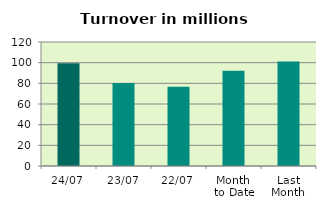
| Category | Series 0 |
|---|---|
| 24/07 | 99.48 |
| 23/07 | 80.367 |
| 22/07 | 76.656 |
| Month 
to Date | 92.258 |
| Last
Month | 101.166 |